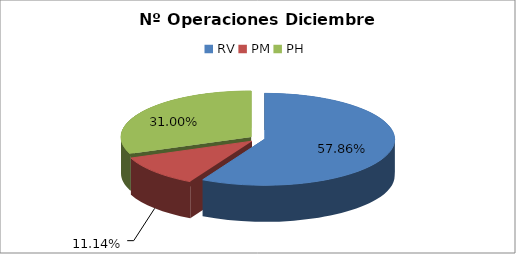
| Category | Series 0 |
|---|---|
| RV | 15951 |
| PM | 3071 |
| PH | 8545 |